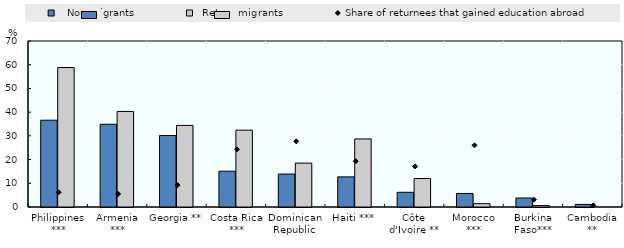
| Category |    Non-migrants |   Return migrants |
|---|---|---|
| Philippines *** | 36.6 | 58.8 |
| Armenia *** | 34.9 | 40.3 |
| Georgia ** | 30.14 | 34.42 |
| Costa Rica *** | 15.1 | 32.4 |
| Dominican Republic | 13.9 | 18.5 |
| Haiti *** | 12.7 | 28.7 |
| Côte d'Ivoire ** | 6.2 | 12 |
| Morocco *** | 5.7 | 1.4 |
| Burkina Faso*** | 3.8 | 0.6 |
| Cambodia ** | 1.1 | 0 |